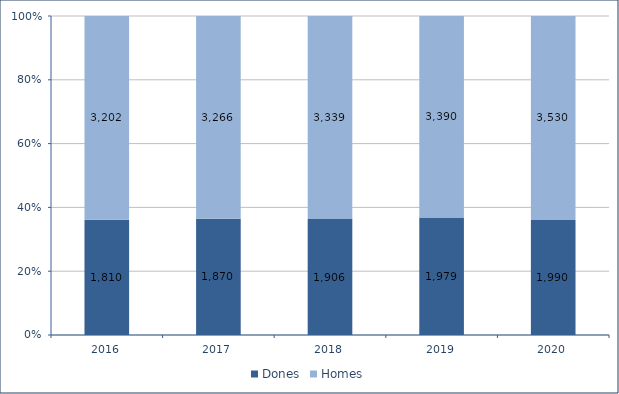
| Category | Dones | Homes |
|---|---|---|
| 2016.0 | 1810 | 3202 |
| 2017.0 | 1870 | 3266 |
| 2018.0 | 1906 | 3339 |
| 2019.0 | 1979 | 3390 |
| 2020.0 | 1990 | 3530 |